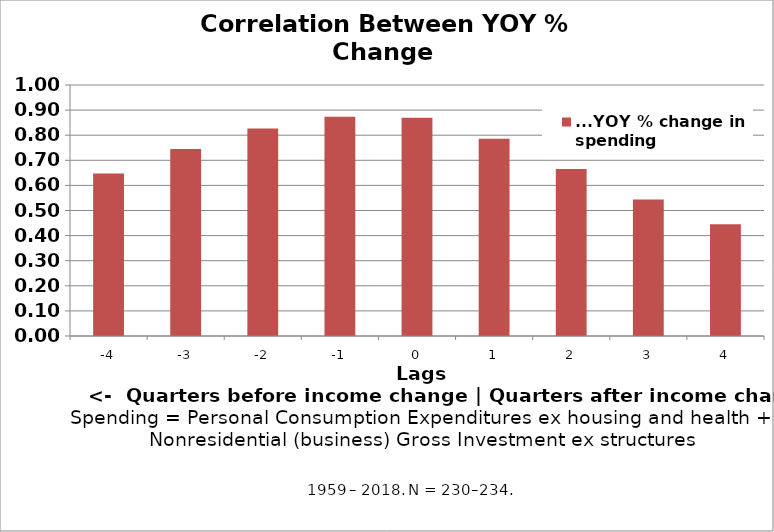
| Category | ...YOY % change in spending |
|---|---|
| -4.0 | 0.647 |
| -3.0 | 0.745 |
| -2.0 | 0.826 |
| -1.0 | 0.874 |
| 0.0 | 0.869 |
| 1.0 | 0.786 |
| 2.0 | 0.665 |
| 3.0 | 0.543 |
| 4.0 | 0.445 |